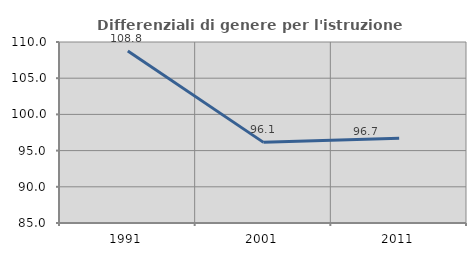
| Category | Differenziali di genere per l'istruzione superiore |
|---|---|
| 1991.0 | 108.768 |
| 2001.0 | 96.136 |
| 2011.0 | 96.718 |